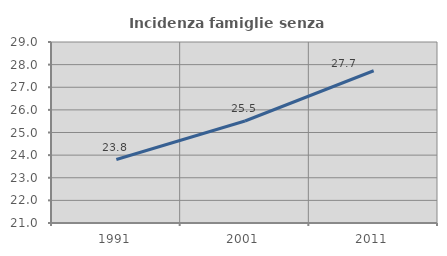
| Category | Incidenza famiglie senza nuclei |
|---|---|
| 1991.0 | 23.806 |
| 2001.0 | 25.507 |
| 2011.0 | 27.73 |